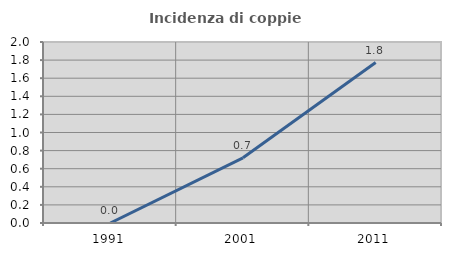
| Category | Incidenza di coppie miste |
|---|---|
| 1991.0 | 0 |
| 2001.0 | 0.72 |
| 2011.0 | 1.773 |